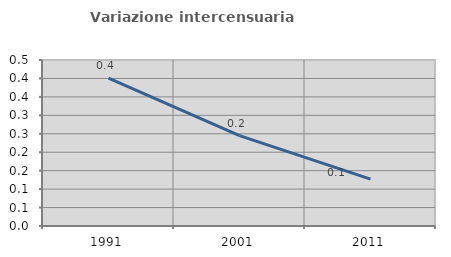
| Category | Variazione intercensuaria annua |
|---|---|
| 1991.0 | 0.401 |
| 2001.0 | 0.245 |
| 2011.0 | 0.127 |